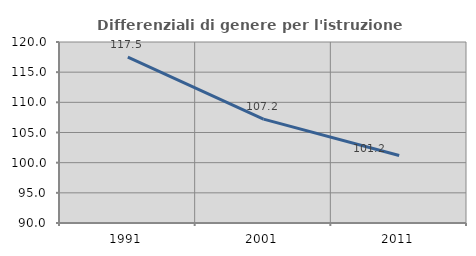
| Category | Differenziali di genere per l'istruzione superiore |
|---|---|
| 1991.0 | 117.49 |
| 2001.0 | 107.223 |
| 2011.0 | 101.197 |